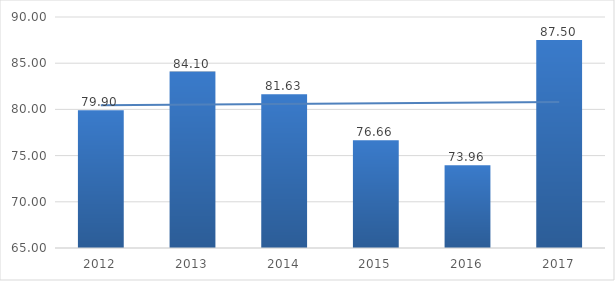
| Category | Series 0 |
|---|---|
| 2012.0 | 79.9 |
| 2013.0 | 84.1 |
| 2014.0 | 81.63 |
| 2015.0 | 76.66 |
| 2016.0 | 73.96 |
| 2017.0 | 87.5 |